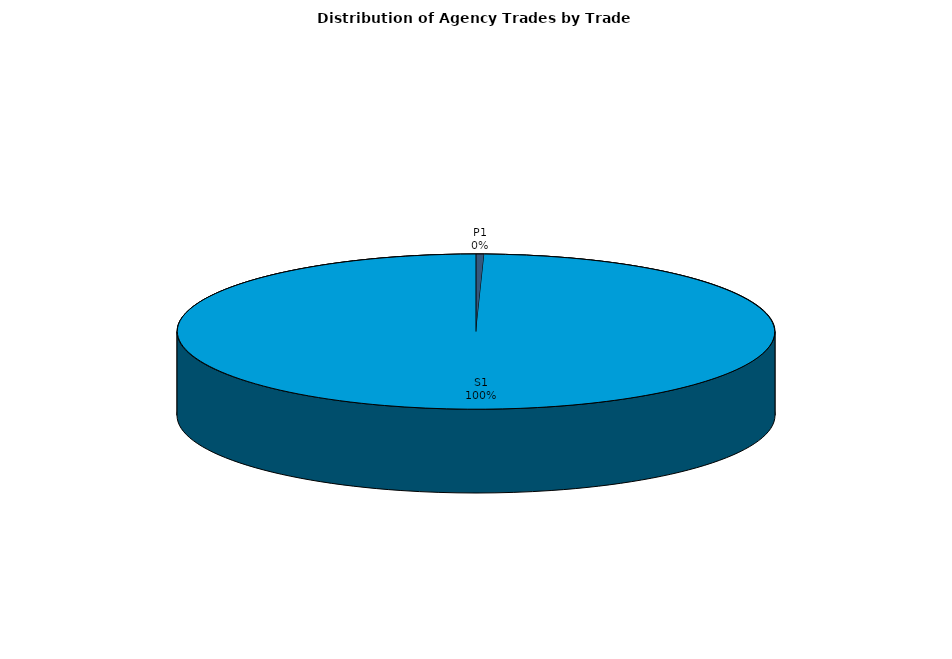
| Category | Series 0 |
|---|---|
| P1 | 26.08 |
| S1 | 5904.036 |